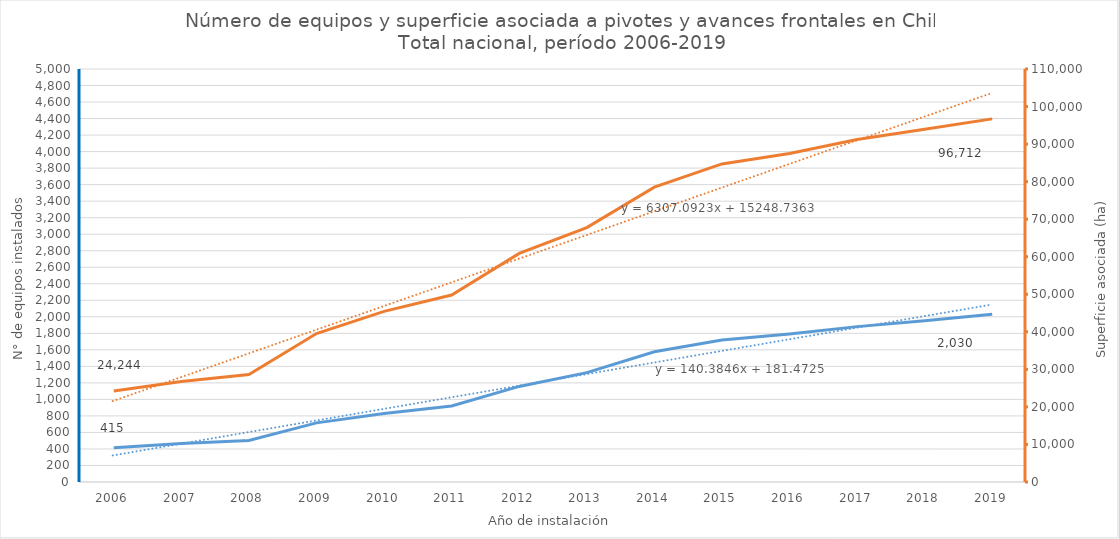
| Category | N° |
|---|---|
| 2006.0 | 415 |
| 2007.0 | 467 |
| 2008.0 | 502 |
| 2009.0 | 716 |
| 2010.0 | 828 |
| 2011.0 | 920 |
| 2012.0 | 1157 |
| 2013.0 | 1324 |
| 2014.0 | 1576 |
| 2015.0 | 1720 |
| 2016.0 | 1793 |
| 2017.0 | 1881 |
| 2018.0 | 1952 |
| 2019.0 | 2030 |